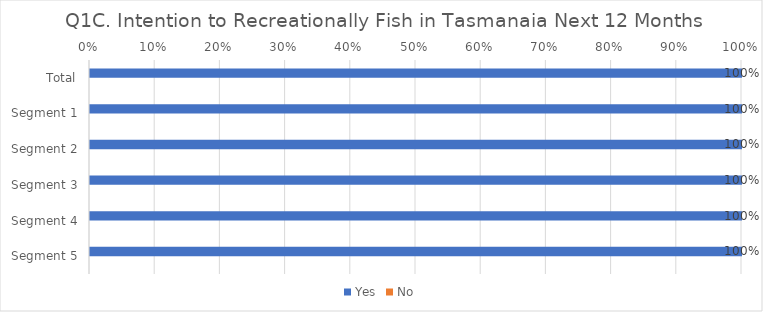
| Category | Yes | No |
|---|---|---|
| Total | 1 | 0 |
| Segment 1 | 1 | 0 |
| Segment 2 | 1 | 0 |
| Segment 3 | 1 | 0 |
| Segment 4 | 1 | 0 |
| Segment 5 | 1 | 0 |